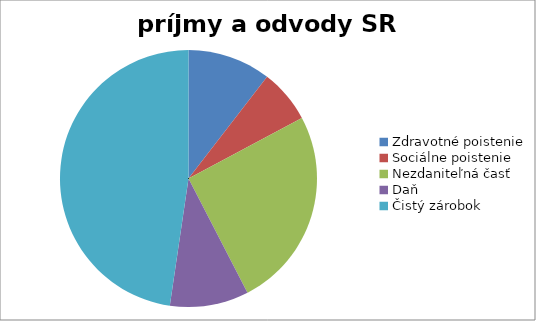
| Category | povolanie |
|---|---|
| Zdravotné poistenie | 140 |
| Sociálne poistenie | 90 |
| Nezdaniteľná časť | 337 |
| Daň | 132.6 |
| Čistý zárobok | 637.4 |